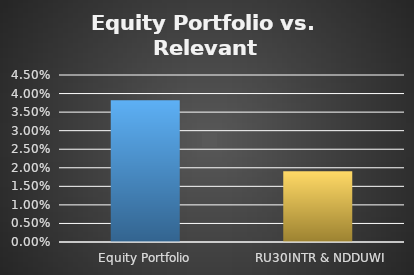
| Category | Series 0 |
|---|---|
| Equity Portfolio | 0.038 |
|   RU30INTR & NDDUWI | 0.019 |